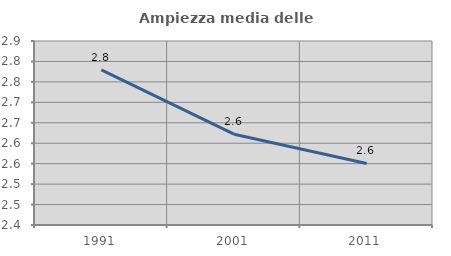
| Category | Ampiezza media delle famiglie |
|---|---|
| 1991.0 | 2.779 |
| 2001.0 | 2.622 |
| 2011.0 | 2.55 |